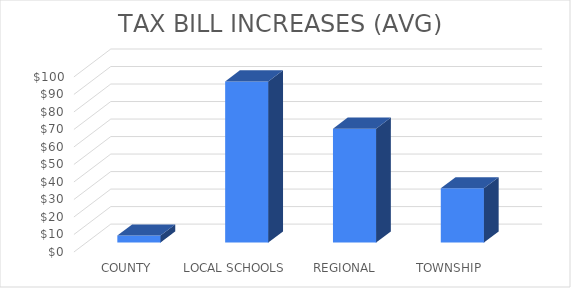
| Category | Series 0 |
|---|---|
| COUNTY | 4 |
| LOCAL SCHOOLS | 92 |
| REGIONAL SCHOOL | 65 |
| TOWNSHIP | 31 |